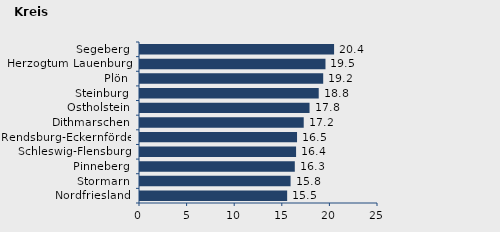
| Category | Wanderungssaldo |
|---|---|
| Nordfriesland | 15.458 |
| Stormarn | 15.816 |
| Pinneberg | 16.261 |
| Schleswig-Flensburg | 16.395 |
| Rendsburg-Eckernförde | 16.496 |
| Dithmarschen | 17.198 |
| Ostholstein | 17.809 |
| Steinburg | 18.774 |
| Plön | 19.243 |
| Herzogtum Lauenburg | 19.483 |
| Segeberg | 20.387 |